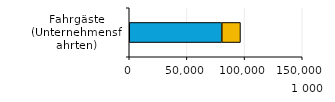
| Category | Öffentliche Unternehmen | Private und gemischtwirtschaftliche Unternehmen |
|---|---|---|
| 0 | 80226 | 16199 |